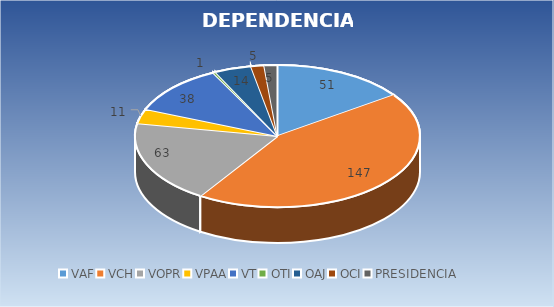
| Category | CANTIDAD |
|---|---|
| VAF | 51 |
| VCH | 147 |
| VOPR | 63 |
| VPAA | 11 |
| VT | 38 |
| OTI | 1 |
| OAJ | 14 |
| OCI | 5 |
| PRESIDENCIA | 5 |